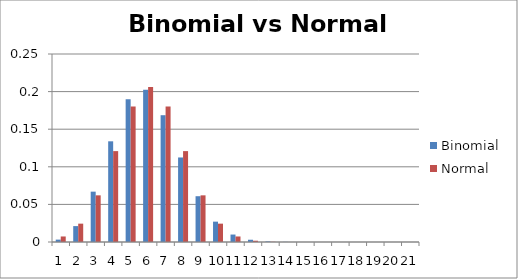
| Category | Binomial | Normal |
|---|---|---|
| 0 | 0.003 | 0.007 |
| 1 | 0.021 | 0.024 |
| 2 | 0.067 | 0.062 |
| 3 | 0.134 | 0.121 |
| 4 | 0.19 | 0.18 |
| 5 | 0.202 | 0.206 |
| 6 | 0.169 | 0.18 |
| 7 | 0.112 | 0.121 |
| 8 | 0.061 | 0.062 |
| 9 | 0.027 | 0.024 |
| 10 | 0.01 | 0.007 |
| 11 | 0.003 | 0.002 |
| 12 | 0.001 | 0 |
| 13 | 0 | 0 |
| 14 | 0 | 0 |
| 15 | 0 | 0 |
| 16 | 0 | 0 |
| 17 | 0 | 0 |
| 18 | 0 | 0 |
| 19 | 0 | 0 |
| 20 | 0 | 0 |